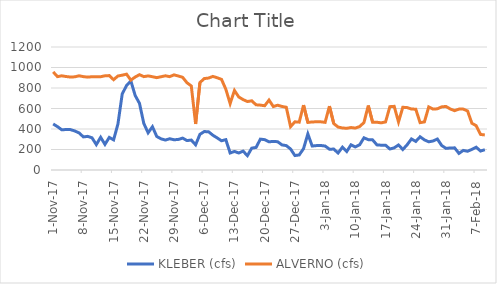
| Category | KLEBER (cfs) | ALVERNO (cfs) |
|---|---|---|
| 2017-11-01 | 449 | 957 |
| 2017-11-02 | 423 | 911 |
| 2017-11-03 | 392 | 919 |
| 2017-11-04 | 395 | 912 |
| 2017-11-05 | 394 | 907 |
| 2017-11-06 | 381 | 909 |
| 2017-11-07 | 362 | 919 |
| 2017-11-08 | 323 | 911 |
| 2017-11-09 | 328 | 906 |
| 2017-11-10 | 314 | 910 |
| 2017-11-11 | 248 | 909 |
| 2017-11-12 | 319 | 910 |
| 2017-11-13 | 250 | 919 |
| 2017-11-14 | 318 | 921 |
| 2017-11-15 | 294 | 881 |
| 2017-11-16 | 448 | 917 |
| 2017-11-17 | 742 | 925 |
| 2017-11-18 | 824 | 935 |
| 2017-11-19 | 869 | 877 |
| 2017-11-20 | 727 | 907 |
| 2017-11-21 | 650 | 930 |
| 2017-11-22 | 454 | 911 |
| 2017-11-23 | 363 | 918 |
| 2017-11-24 | 422 | 910 |
| 2017-11-25 | 327 | 901 |
| 2017-11-26 | 304 | 910 |
| 2017-11-27 | 292 | 919 |
| 2017-11-28 | 305 | 911 |
| 2017-11-29 | 295 | 928 |
| 2017-11-30 | 298 | 917 |
| 2017-12-01 | 311 | 904 |
| 2017-12-02 | 287 | 851 |
| 2017-12-03 | 292 | 820 |
| 2017-12-04 | 246 | 449 |
| 2017-12-05 | 348 | 853 |
| 2017-12-06 | 375 | 892 |
| 2017-12-07 | 373 | 897 |
| 2017-12-08 | 339 | 913 |
| 2017-12-09 | 313 | 900 |
| 2017-12-10 | 285 | 884 |
| 2017-12-11 | 296 | 788 |
| 2017-12-12 | 166 | 648 |
| 2017-12-13 | 181 | 776 |
| 2017-12-14 | 166 | 712 |
| 2017-12-15 | 184 | 687 |
| 2017-12-16 | 140 | 668 |
| 2017-12-17 | 213 | 675 |
| 2017-12-18 | 220 | 636 |
| 2017-12-19 | 301 | 633 |
| 2017-12-20 | 296 | 627 |
| 2017-12-21 | 275 | 682 |
| 2017-12-22 | 279 | 619 |
| 2017-12-23 | 276 | 632 |
| 2017-12-24 | 245 | 620 |
| 2017-12-25 | 238 | 612 |
| 2017-12-26 | 205 | 423 |
| 2017-12-27 | 141 | 470 |
| 2017-12-28 | 147 | 467 |
| 2017-12-29 | 208 | 633 |
| 2017-12-30 | 352 | 464 |
| 2017-12-31 | 234 | 469 |
| 2018-01-01 | 238 | 470 |
| 2018-01-02 | 239 | 470 |
| 2018-01-03 | 234 | 465 |
| 2018-01-04 | 203 | 623 |
| 2018-01-05 | 204 | 453 |
| 2018-01-06 | 166 | 419 |
| 2018-01-07 | 222 | 410 |
| 2018-01-08 | 180 | 407 |
| 2018-01-09 | 246 | 414 |
| 2018-01-10 | 225 | 409 |
| 2018-01-11 | 246 | 424 |
| 2018-01-12 | 314 | 463 |
| 2018-01-13 | 296 | 629 |
| 2018-01-14 | 294 | 466 |
| 2018-01-15 | 245 | 466 |
| 2018-01-16 | 242 | 460 |
| 2018-01-17 | 242 | 469 |
| 2018-01-18 | 205 | 618 |
| 2018-01-19 | 216 | 621 |
| 2018-01-20 | 244 | 469 |
| 2018-01-21 | 200 | 612 |
| 2018-01-22 | 246 | 609 |
| 2018-01-23 | 303 | 595 |
| 2018-01-24 | 279 | 593 |
| 2018-01-25 | 324 | 462 |
| 2018-01-26 | 294 | 469 |
| 2018-01-27 | 275 | 615 |
| 2018-01-28 | 283 | 594 |
| 2018-01-29 | 302 | 597 |
| 2018-01-30 | 239 | 616 |
| 2018-01-31 | 211 | 620 |
| 2018-02-01 | 215 | 595 |
| 2018-02-02 | 216 | 579 |
| 2018-02-03 | 162 | 594 |
| 2018-02-04 | 191 | 594 |
| 2018-02-05 | 183 | 576 |
| 2018-02-06 | 201 | 456 |
| 2018-02-07 | 222 | 432 |
| 2018-02-08 | 185 | 347 |
| 2018-02-09 | 198 | 342 |